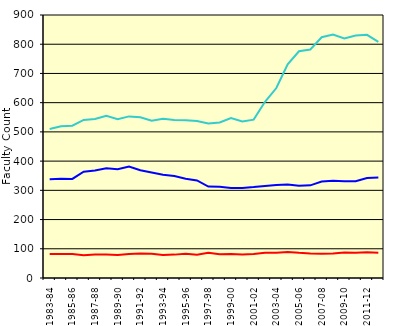
| Category | Schools of Arts, Sciences, & Engineering | Eastman School of Music | School of Medicine & Dentistry |
|---|---|---|---|
| 1983-84 | 338 | 82 | 510 |
| 1984-85 | 340 | 82 | 519 |
| 1985-86 | 339 | 82 | 521 |
| 1986-87 | 364 | 78 | 541 |
| 1987-88 | 368 | 80 | 544 |
| 1988-89 | 375.5 | 80 | 555 |
| 1989-90 | 372.5 | 79 | 543 |
| 1990-91 | 381.5 | 82 | 553 |
| 1991-92 | 368.5 | 84 | 550 |
| 1992-93 | 361 | 83 | 538 |
| 1993-94 | 353 | 79 | 545 |
| 1994-95 | 349 | 80 | 541 |
| 1995-96 | 340 | 83 | 540 |
| 1996-97 | 334 | 80 | 537 |
| 1997-98 | 313 | 86 | 529 |
| 1998-99 | 312 | 81 | 532 |
| 1999-00 | 308 | 82 | 547 |
| 2000-01 | 308 | 80 | 536 |
| 2001-02 | 311 | 82 | 542 |
| 2002-03 | 315 | 86 | 603 |
| 2003-04 | 318 | 86 | 650 |
| 2004-05 | 320 | 89 | 731 |
| 2005-06 | 316 | 86 | 776 |
| 2006-07 | 317 | 84 | 782 |
| 2007-08 | 330 | 83 | 824 |
| 2008-09 | 333 | 84 | 833 |
| 2009-10 | 331 | 87 | 820 |
| 2010-11 | 331 | 86 | 830 |
| 2011-12 | 342 | 88 | 832 |
| 2012-13 | 344 | 86 | 808 |